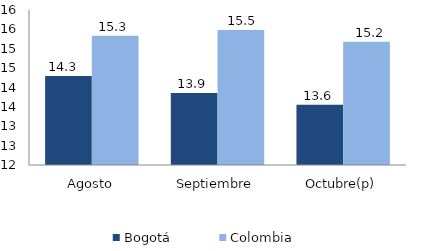
| Category | Bogotá | Colombia |
|---|---|---|
| Agosto | 14.298 | 15.337 |
| Septiembre | 13.861 | 15.485 |
| Octubre(p) | 13.555 | 15.178 |